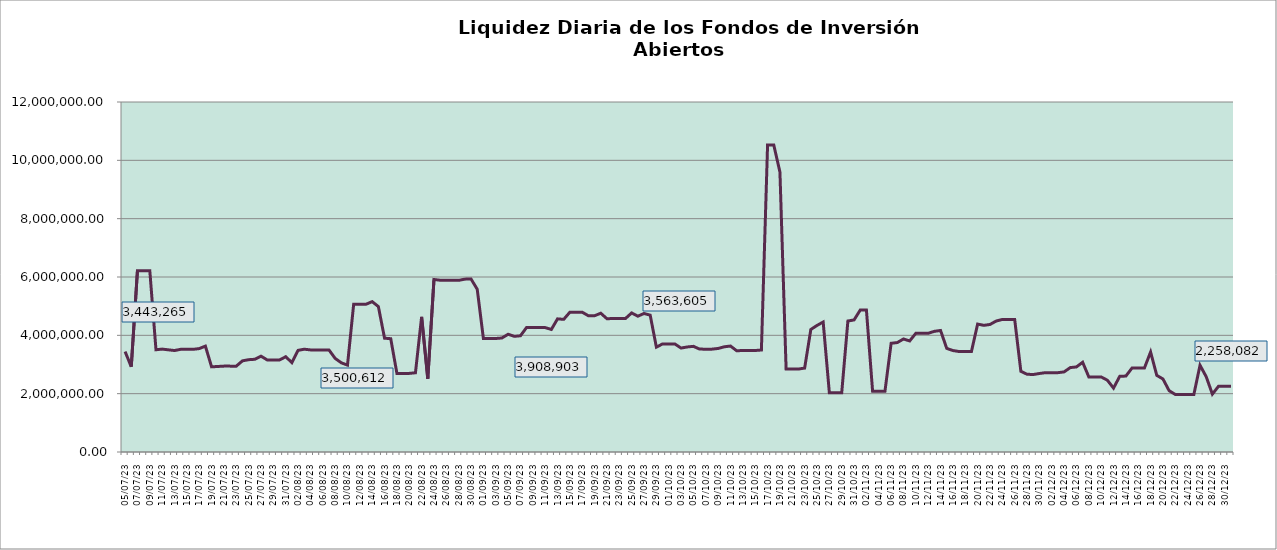
| Category | Liquidez |
|---|---|
| 2023-07-05 | 3443264.59 |
| 2023-07-06 | 2922086.26 |
| 2023-07-07 | 6215301.19 |
| 2023-07-08 | 6214818.06 |
| 2023-07-09 | 6214335 |
| 2023-07-10 | 3505783.1 |
| 2023-07-11 | 3528007.14 |
| 2023-07-12 | 3502871.73 |
| 2023-07-13 | 3479337.86 |
| 2023-07-14 | 3520491.3 |
| 2023-07-15 | 3520232.19 |
| 2023-07-16 | 3519973.11 |
| 2023-07-17 | 3545675.46 |
| 2023-07-18 | 3629696.72 |
| 2023-07-19 | 2920012.1 |
| 2023-07-20 | 2932249.68 |
| 2023-07-21 | 2944374.94 |
| 2023-07-22 | 2944158.32 |
| 2023-07-23 | 2943941.75 |
| 2023-07-24 | 3125419.91 |
| 2023-07-25 | 3165065.64 |
| 2023-07-26 | 3178826.9 |
| 2023-07-27 | 3285819.45 |
| 2023-07-28 | 3156983.5 |
| 2023-07-29 | 3156751.4 |
| 2023-07-30 | 3156519.28 |
| 2023-07-31 | 3265844.95 |
| 2023-08-01 | 3065302.71 |
| 2023-08-02 | 3484768.77 |
| 2023-08-03 | 3524204.14 |
| 2023-08-04 | 3500869.16 |
| 2023-08-05 | 3500611.87 |
| 2023-08-06 | 3500354.64 |
| 2023-08-07 | 3500097.45 |
| 2023-08-08 | 3210366.89 |
| 2023-08-09 | 3058007.38 |
| 2023-08-10 | 2978560.19 |
| 2023-08-11 | 5066410.64 |
| 2023-08-12 | 5066038.5 |
| 2023-08-13 | 5065666.44 |
| 2023-08-14 | 5155723.09 |
| 2023-08-15 | 4985776.26 |
| 2023-08-16 | 3901327.34 |
| 2023-08-17 | 3885292.7 |
| 2023-08-18 | 2695387.55 |
| 2023-08-19 | 2695189.68 |
| 2023-08-20 | 2694991.84 |
| 2023-08-21 | 2716793.76 |
| 2023-08-22 | 4634977.84 |
| 2023-08-23 | 2511407.6 |
| 2023-08-24 | 5914568.84 |
| 2023-08-25 | 5889630.33 |
| 2023-08-26 | 5889198.19 |
| 2023-08-27 | 5888766.09 |
| 2023-08-28 | 5884515.02 |
| 2023-08-29 | 5926591.84 |
| 2023-08-30 | 5931501.64 |
| 2023-08-31 | 5580057.74 |
| 2023-09-01 | 3892644.21 |
| 2023-09-02 | 3892358.73 |
| 2023-09-03 | 3892073.31 |
| 2023-09-04 | 3908903.28 |
| 2023-09-05 | 4036842.93 |
| 2023-09-06 | 3965911.15 |
| 2023-09-07 | 3984917.66 |
| 2023-09-08 | 4271911.78 |
| 2023-09-09 | 4271598.63 |
| 2023-09-10 | 4271285.58 |
| 2023-09-11 | 4265619.54 |
| 2023-09-12 | 4201445.83 |
| 2023-09-13 | 4564803.62 |
| 2023-09-14 | 4547943.86 |
| 2023-09-15 | 4793327.23 |
| 2023-09-16 | 4792917.57 |
| 2023-09-17 | 4792507.95 |
| 2023-09-18 | 4670390.41 |
| 2023-09-19 | 4672628.79 |
| 2023-09-20 | 4757974.91 |
| 2023-09-21 | 4568679.81 |
| 2023-09-22 | 4578069.45 |
| 2023-09-23 | 4577678.42 |
| 2023-09-24 | 4577287.46 |
| 2023-09-25 | 4768442.27 |
| 2023-09-26 | 4656041.24 |
| 2023-09-27 | 4749440.99 |
| 2023-09-28 | 4691215.04 |
| 2023-09-29 | 3594829.12 |
| 2023-09-30 | 3705131.39 |
| 2023-10-01 | 3704830.2 |
| 2023-10-02 | 3702299.07 |
| 2023-10-03 | 3563604.91 |
| 2023-10-04 | 3601766.17 |
| 2023-10-05 | 3622522.29 |
| 2023-10-06 | 3527179.42 |
| 2023-10-07 | 3526892.83 |
| 2023-10-08 | 3526606.27 |
| 2023-10-09 | 3549867.98 |
| 2023-10-10 | 3607916.07 |
| 2023-10-11 | 3632777.48 |
| 2023-10-12 | 3470821.4 |
| 2023-10-13 | 3480438.7 |
| 2023-10-14 | 3480170.23 |
| 2023-10-15 | 3479901.75 |
| 2023-10-16 | 3496944.65 |
| 2023-10-17 | 10529377.51 |
| 2023-10-18 | 10527427.59 |
| 2023-10-19 | 9598279.41 |
| 2023-10-20 | 2843795.49 |
| 2023-10-21 | 2843576.21 |
| 2023-10-22 | 2843356.97 |
| 2023-10-23 | 2877543.06 |
| 2023-10-24 | 4199796.46 |
| 2023-10-25 | 4339276.81 |
| 2023-10-26 | 4455991.46 |
| 2023-10-27 | 2029862.19 |
| 2023-10-28 | 2029705.75 |
| 2023-10-29 | 2029549.34 |
| 2023-10-30 | 4491312.09 |
| 2023-10-31 | 4528124.94 |
| 2023-11-01 | 4866315.82 |
| 2023-11-02 | 4865940.97 |
| 2023-11-03 | 2084311.74 |
| 2023-11-04 | 2084151.19 |
| 2023-11-05 | 2083990.68 |
| 2023-11-06 | 3727221.54 |
| 2023-11-07 | 3752037.55 |
| 2023-11-08 | 3875044.89 |
| 2023-11-09 | 3807636.9 |
| 2023-11-10 | 4070553.01 |
| 2023-11-11 | 4070322.09 |
| 2023-11-12 | 4070091.24 |
| 2023-11-13 | 4137469.64 |
| 2023-11-14 | 4166581.56 |
| 2023-11-15 | 3552454.63 |
| 2023-11-16 | 3478407.46 |
| 2023-11-17 | 3445309.06 |
| 2023-11-18 | 3445113.71 |
| 2023-11-19 | 3444918.35 |
| 2023-11-20 | 4386196.81 |
| 2023-11-21 | 4342385.83 |
| 2023-11-22 | 4372626.66 |
| 2023-11-23 | 4489820.31 |
| 2023-11-24 | 4544220.56 |
| 2023-11-25 | 4543962.98 |
| 2023-11-26 | 4543705.44 |
| 2023-11-27 | 2766288.53 |
| 2023-11-28 | 2665717.08 |
| 2023-11-29 | 2656380.27 |
| 2023-11-30 | 2691860.79 |
| 2023-12-01 | 2720262.81 |
| 2023-12-02 | 2720108.68 |
| 2023-12-03 | 2719954.59 |
| 2023-12-04 | 2746705.4 |
| 2023-12-05 | 2894133.5 |
| 2023-12-06 | 2916814.53 |
| 2023-12-07 | 3077187.61 |
| 2023-12-08 | 2573849.69 |
| 2023-12-09 | 2573703.91 |
| 2023-12-10 | 2573558.18 |
| 2023-12-11 | 2461459.62 |
| 2023-12-12 | 2190702.84 |
| 2023-12-13 | 2593963.56 |
| 2023-12-14 | 2603847 |
| 2023-12-15 | 2880624.68 |
| 2023-12-16 | 2880496.53 |
| 2023-12-17 | 2880368.4 |
| 2023-12-18 | 3427569.02 |
| 2023-12-19 | 2626945.09 |
| 2023-12-20 | 2503393.87 |
| 2023-12-21 | 2102165.32 |
| 2023-12-22 | 1971821.96 |
| 2023-12-23 | 1971734.3 |
| 2023-12-24 | 1971646.63 |
| 2023-12-25 | 1971558.94 |
| 2023-12-26 | 2974522.85 |
| 2023-12-27 | 2581700.12 |
| 2023-12-28 | 1984714.53 |
| 2023-12-29 | 2254994.88 |
| 2023-12-30 | 2254894.64 |
| 2023-12-31 | 2258082.15 |